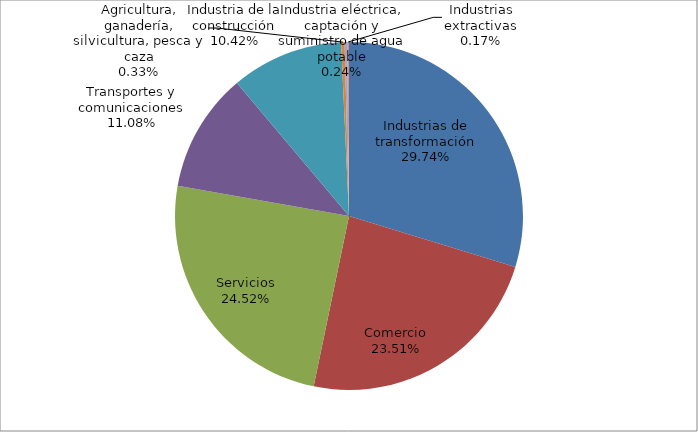
| Category | Series 0 |
|---|---|
| Industrias de transformación | 33262 |
| Comercio | 26294 |
| Servicios | 27424 |
| Transportes y comunicaciones | 12392 |
| Industria de la construcción | 11647 |
| Agricultura, ganadería, silvicultura, pesca y caza | 362 |
| Industria eléctrica, captación y suministro de agua potable | 262 |
| Industrias extractivas | 186 |